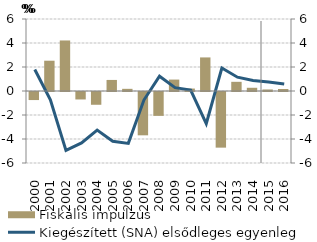
| Category | Fiskális impulzus |
|---|---|
| 0 | -0.672 |
| 1900-01-01 | 2.524 |
| 1900-01-02 | 4.211 |
| 1900-01-03 | -0.622 |
| 1900-01-04 | -1.064 |
| 1900-01-05 | 0.922 |
| 1900-01-06 | 0.18 |
| 1900-01-07 | -3.61 |
| 1900-01-08 | -1.989 |
| 1900-01-09 | 0.952 |
| 1900-01-10 | 0.204 |
| 1900-01-11 | 2.798 |
| 1900-01-12 | -4.637 |
| 1900-01-13 | 0.765 |
| 1900-01-14 | 0.268 |
| 1900-01-15 | 0.127 |
| 1900-01-16 | 0.166 |